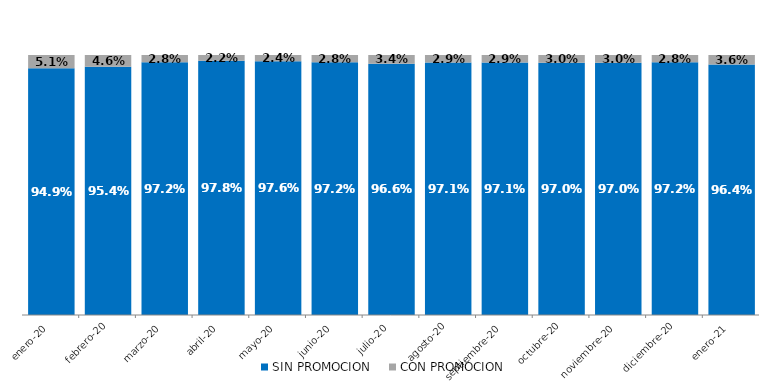
| Category | SIN PROMOCION   | CON PROMOCION   |
|---|---|---|
| 2020-01-01 | 0.949 | 0.051 |
| 2020-02-01 | 0.954 | 0.046 |
| 2020-03-01 | 0.972 | 0.028 |
| 2020-04-01 | 0.978 | 0.022 |
| 2020-05-01 | 0.976 | 0.024 |
| 2020-06-01 | 0.972 | 0.028 |
| 2020-07-01 | 0.966 | 0.034 |
| 2020-08-01 | 0.971 | 0.029 |
| 2020-09-01 | 0.971 | 0.029 |
| 2020-10-01 | 0.97 | 0.03 |
| 2020-11-01 | 0.97 | 0.03 |
| 2020-12-01 | 0.972 | 0.028 |
| 2021-01-01 | 0.964 | 0.036 |